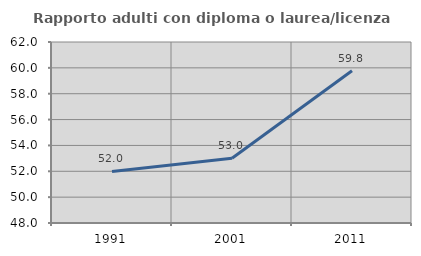
| Category | Rapporto adulti con diploma o laurea/licenza media  |
|---|---|
| 1991.0 | 51.984 |
| 2001.0 | 53.014 |
| 2011.0 | 59.78 |